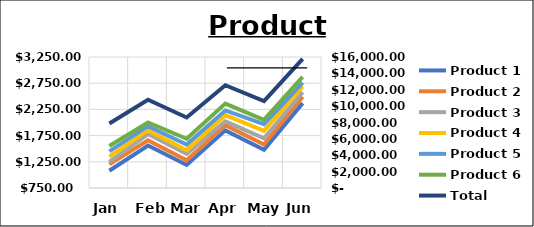
| Category | Product 1 | Product 2 | Product 3 | Product 4 | Product 5 | Product 6 |
|---|---|---|---|---|---|---|
| Jan | 1080 | 1200 | 1250 | 1350 | 1450 | 1550 |
| Feb | 1560 | 1660 | 1780 | 1850 | 1930 | 2000 |
| Mar | 1190 | 1280 | 1400 | 1470 | 1580 | 1690 |
| Apr | 1850 | 1950 | 2020 | 2140 | 2230 | 2360 |
| May | 1480 | 1580 | 1700 | 1840 | 1970 | 2050 |
| Jun | 2370 | 2490 | 2580 | 2690 | 2760 | 2870 |